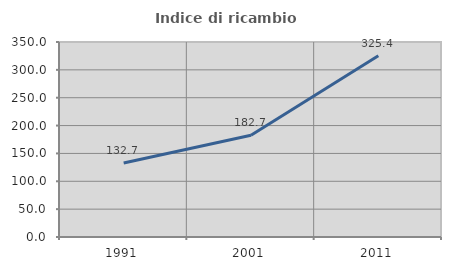
| Category | Indice di ricambio occupazionale  |
|---|---|
| 1991.0 | 132.685 |
| 2001.0 | 182.734 |
| 2011.0 | 325.41 |